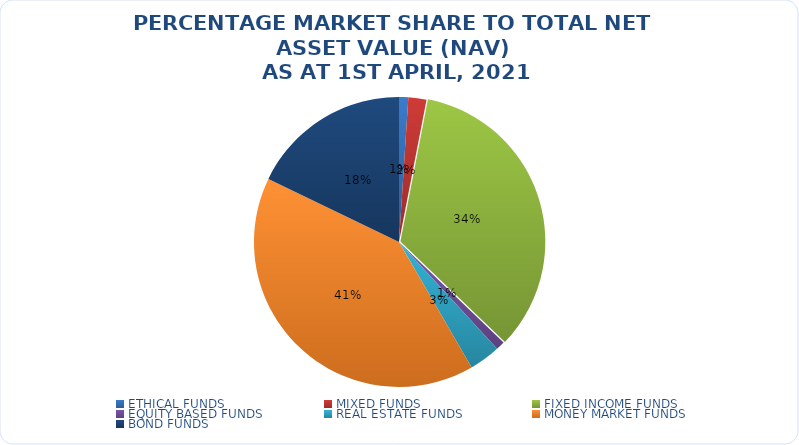
| Category | NET ASSET VALUE |
|---|---|
| ETHICAL FUNDS | 14834615310.5 |
| MIXED FUNDS | 28995805087.06 |
| FIXED INCOME FUNDS | 491915046087.462 |
| EQUITY BASED FUNDS | 14379261362.233 |
| REAL ESTATE FUNDS | 49998344212.991 |
| MONEY MARKET FUNDS | 583592770615.669 |
| BOND FUNDS | 257115725078.94 |